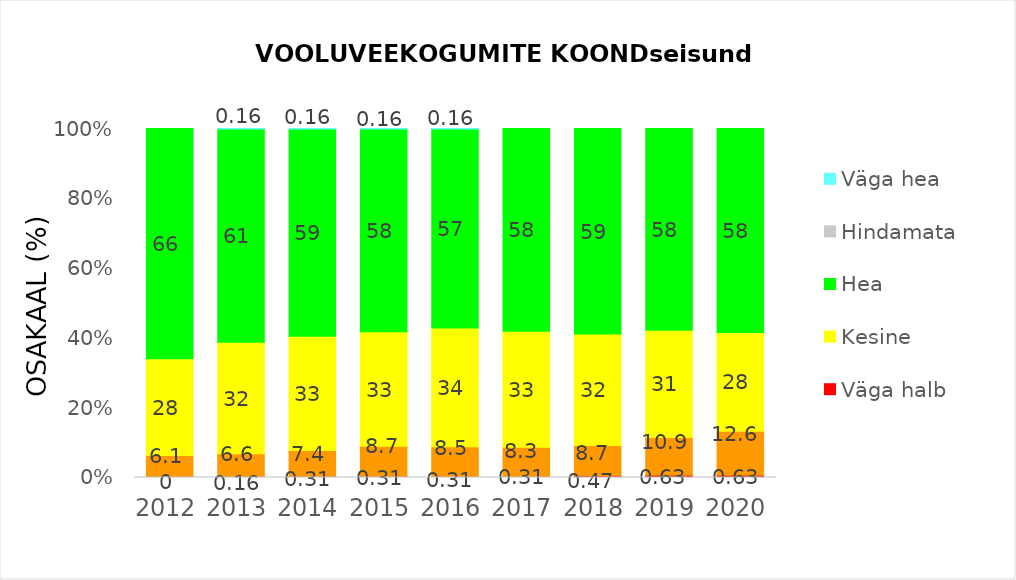
| Category | Väga halb | Halb | Kesine | Hea | Hindamata | Väga hea |
|---|---|---|---|---|---|---|
| 2012.0 | 0.157 | 6.142 | 27.717 | 65.984 | 0 | 0 |
| 2013.0 | 0.157 | 6.614 | 31.969 | 61.102 | 0 | 0.157 |
| 2014.0 | 0.315 | 7.402 | 32.756 | 59.37 | 0 | 0.157 |
| 2015.0 | 0.315 | 8.661 | 32.756 | 58.11 | 0 | 0.157 |
| 2016.0 | 0.315 | 8.504 | 34.016 | 57.008 | 0 | 0.157 |
| 2017.0 | 0.315 | 8.346 | 33.228 | 58.11 | 0 | 0 |
| 2018.0 | 0.472 | 8.661 | 31.969 | 58.898 | 0 | 0 |
| 2019.0 | 0.63 | 10.866 | 30.709 | 57.795 | 0 | 0 |
| 2020.0 | 0.63 | 12.598 | 28.346 | 58.425 | 0 | 0 |